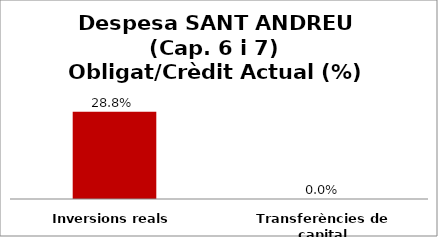
| Category | Series 0 |
|---|---|
| Inversions reals | 0.288 |
| Transferències de capital | 0 |